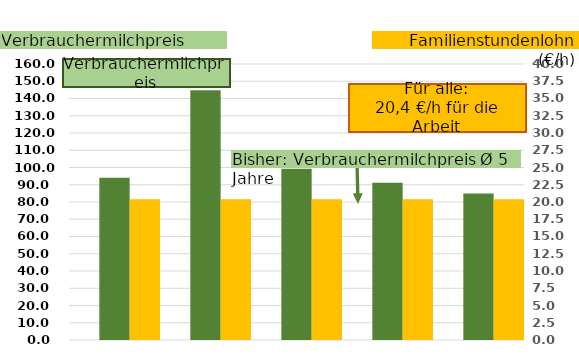
| Category | Milchpreis |
|---|---|
| Bayern Ø 52 Kühe | 93.992 |
| 18 Kühe | 144.732 |
| 39 Kühe | 99.335 |
| 60 Kühe | 91.111 |
| 94 Kühe | 84.939 |